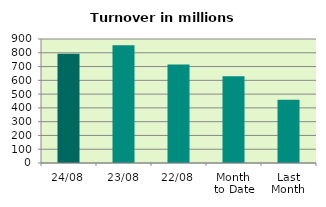
| Category | Series 0 |
|---|---|
| 24/08 | 793.271 |
| 23/08 | 854.048 |
| 22/08 | 714.534 |
| Month 
to Date | 630.499 |
| Last
Month | 458.733 |